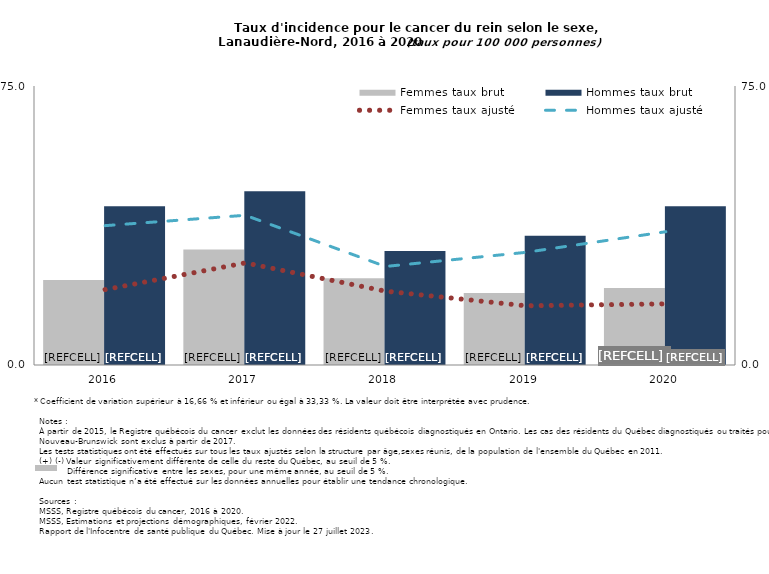
| Category | Femmes taux brut | Hommes taux brut |
|---|---|---|
| 2016.0 | 22.845 | 42.693 |
| 2017.0 | 31.076 | 46.736 |
| 2018.0 | 23.314 | 30.648 |
| 2019.0 | 19.328 | 34.712 |
| 2020.0 | 20.729 | 42.674 |